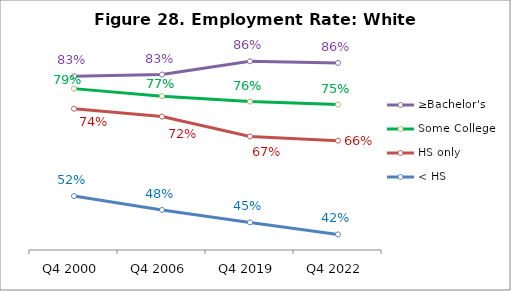
| Category | ≥Bachelor's | Some College | HS only | < HS |
|---|---|---|---|---|
| Q4 2000 | 0.825 | 0.793 | 0.742 | 0.518 |
| Q4 2006 | 0.83 | 0.774 | 0.722 | 0.483 |
| Q4 2019 | 0.864 | 0.76 | 0.671 | 0.451 |
| Q4 2022 | 0.859 | 0.753 | 0.66 | 0.42 |